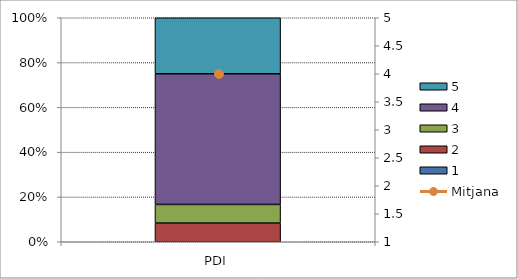
| Category | 1 | 2 | 3 | 4 | 5 |
|---|---|---|---|---|---|
| PDI | 0 | 1 | 1 | 7 | 3 |